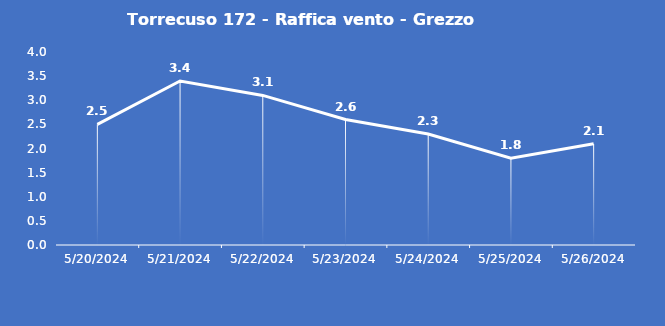
| Category | Torrecuso 172 - Raffica vento - Grezzo (m/s) |
|---|---|
| 5/20/24 | 2.5 |
| 5/21/24 | 3.4 |
| 5/22/24 | 3.1 |
| 5/23/24 | 2.6 |
| 5/24/24 | 2.3 |
| 5/25/24 | 1.8 |
| 5/26/24 | 2.1 |